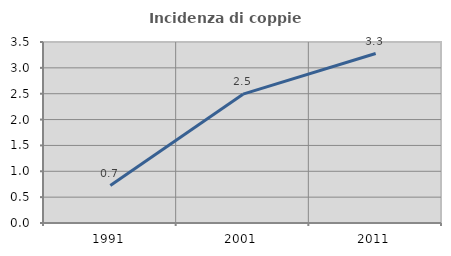
| Category | Incidenza di coppie miste |
|---|---|
| 1991.0 | 0.724 |
| 2001.0 | 2.492 |
| 2011.0 | 3.277 |